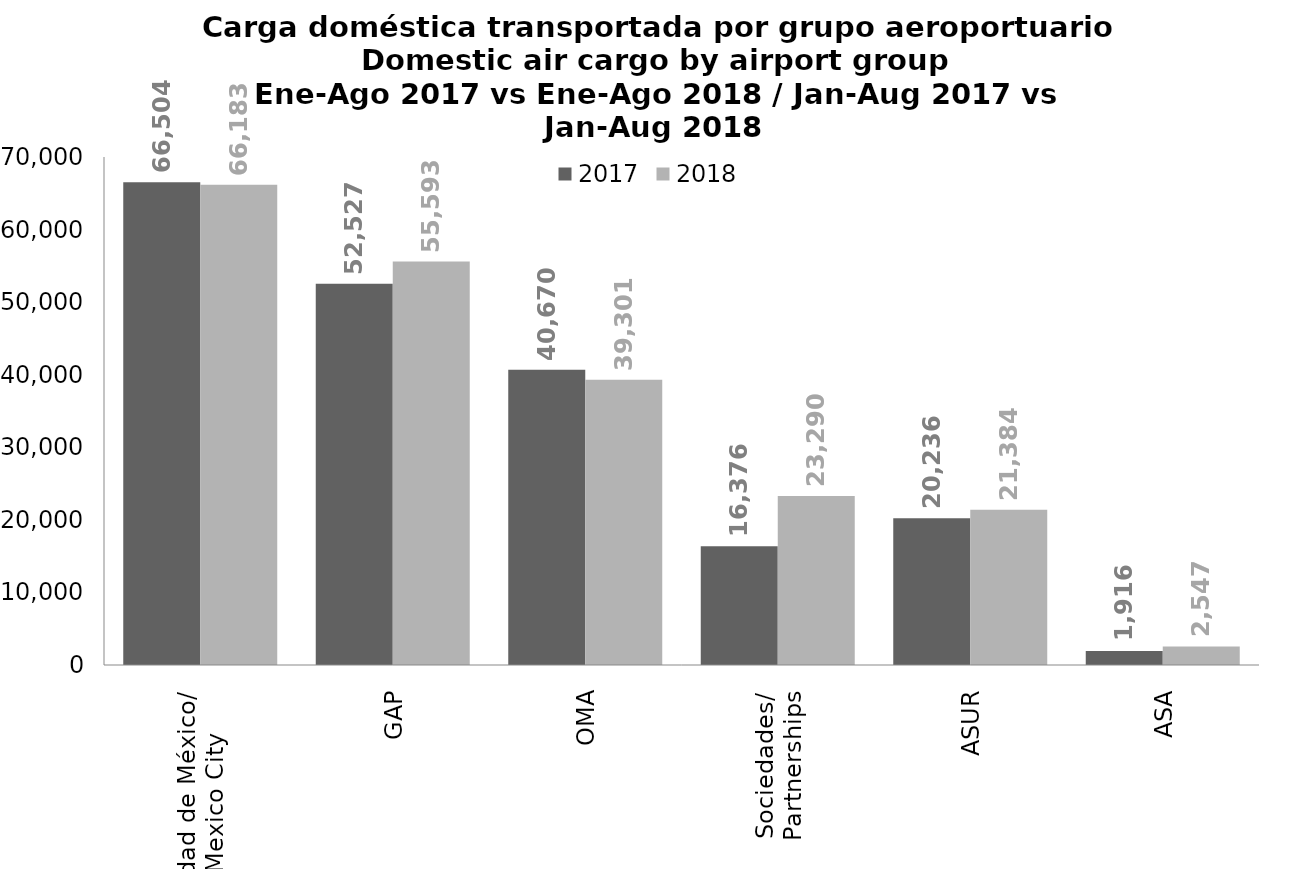
| Category | 2017 | 2018 |
|---|---|---|
| Ciudad de México/
Mexico City | 66504.09 | 66182.71 |
| GAP | 52527.102 | 55593.291 |
| OMA | 40669.878 | 39300.854 |
| Sociedades/
Partnerships | 16375.691 | 23289.722 |
| ASUR | 20236.402 | 21383.913 |
| ASA | 1915.66 | 2546.543 |